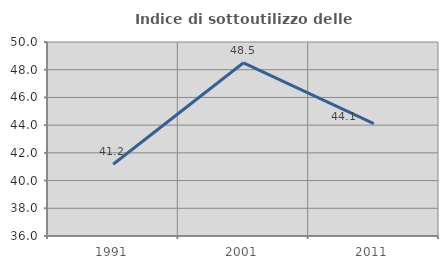
| Category | Indice di sottoutilizzo delle abitazioni  |
|---|---|
| 1991.0 | 41.176 |
| 2001.0 | 48.5 |
| 2011.0 | 44.103 |